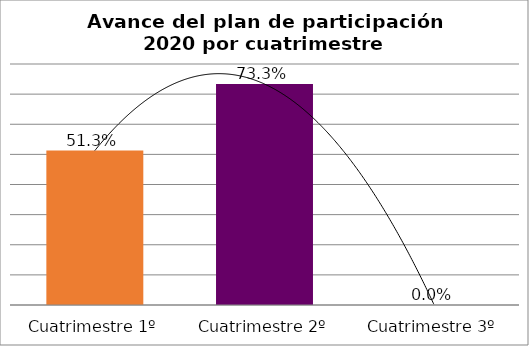
| Category | Avnace por perioros |
|---|---|
| Cuatrimestre 1º | 0.513 |
| Cuatrimestre 2º | 0.733 |
| Cuatrimestre 3º | 0 |